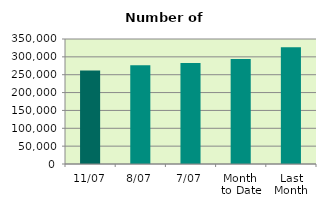
| Category | Series 0 |
|---|---|
| 11/07 | 261968 |
| 8/07 | 276720 |
| 7/07 | 282872 |
| Month 
to Date | 293805.143 |
| Last
Month | 326674.818 |